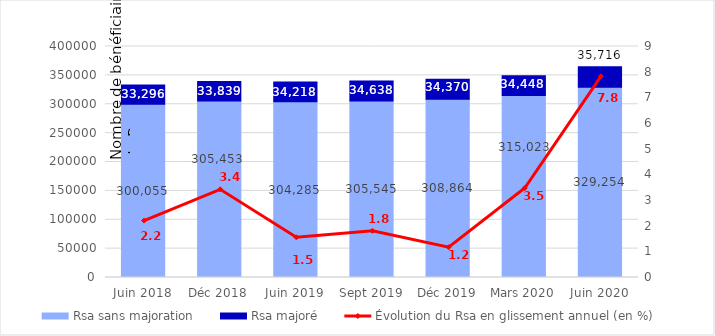
| Category | Rsa sans majoration | Rsa majoré |
|---|---|---|
| Juin 2018 | 300055 | 33296 |
| Déc 2018 | 305453 | 33839 |
| Juin 2019 | 304285 | 34218 |
| Sept 2019 | 305545 | 34638 |
| Déc 2019 | 308864 | 34370 |
| Mars 2020 | 315023 | 34448 |
| Juin 2020 | 329254 | 35716 |